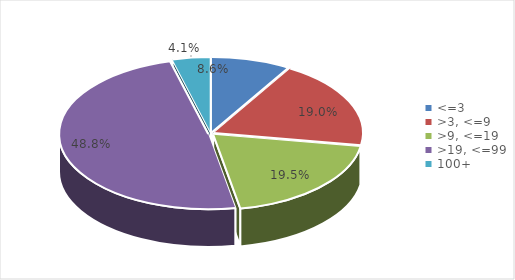
| Category | Enterprises  |
|---|---|
| <=3 | 0.086 |
| >3, <=9 | 0.19 |
| >9, <=19 | 0.195 |
| >19, <=99 | 0.488 |
| 100+ | 0.041 |